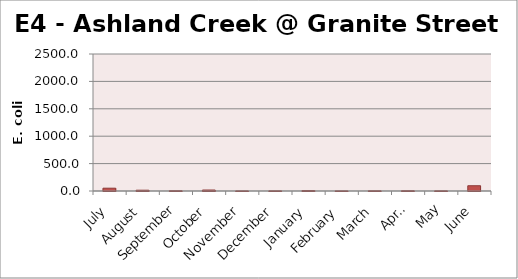
| Category | E. coli MPN |
|---|---|
| July | 51.2 |
| August | 14.4 |
| September | 4.1 |
| October | 17.9 |
| November | 1 |
| December | 2 |
| January | 7.4 |
| February | 1 |
| March | 3 |
| April | 4.1 |
| May | 2 |
| June | 96 |